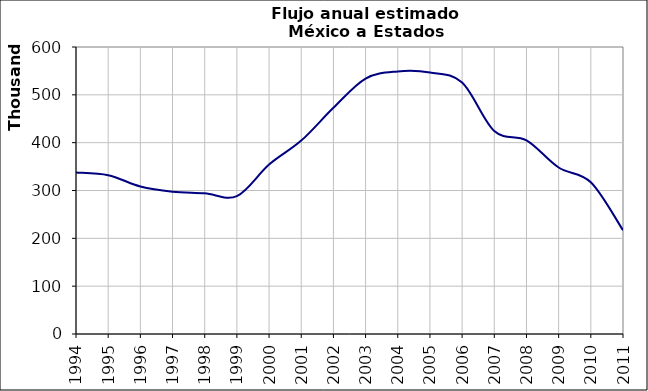
| Category | Flujo anual |
|---|---|
| 1994.0 | 337796.16 |
| 1995.0 | 332085.154 |
| 1996.0 | 308363.04 |
| 1997.0 | 297545.453 |
| 1998.0 | 294086.72 |
| 1999.0 | 288229.093 |
| 2000.0 | 354257.76 |
| 2001.0 | 404343.886 |
| 2002.0 | 472895.686 |
| 2003.0 | 534095.429 |
| 2004.0 | 548921.44 |
| 2005.0 | 546659.394 |
| 2006.0 | 525788.352 |
| 2007.0 | 424291.716 |
| 2008.0 | 404718.752 |
| 2009.0 | 348062.857 |
| 2010.0 | 317214.72 |
| 2011.0 | 217015.429 |